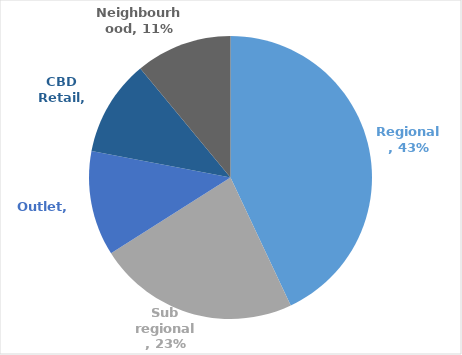
| Category | Series 0 |
|---|---|
| Regional | 0.43 |
| Sub regional | 0.23 |
| Outlet | 0.12 |
| CBD Retail | 0.11 |
| Neighbourhood | 0.11 |